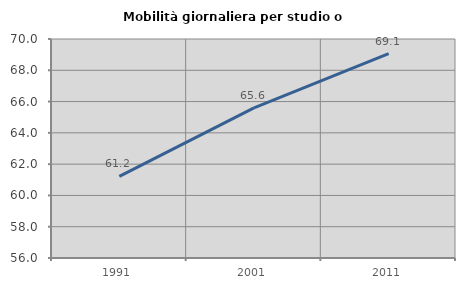
| Category | Mobilità giornaliera per studio o lavoro |
|---|---|
| 1991.0 | 61.215 |
| 2001.0 | 65.602 |
| 2011.0 | 69.069 |